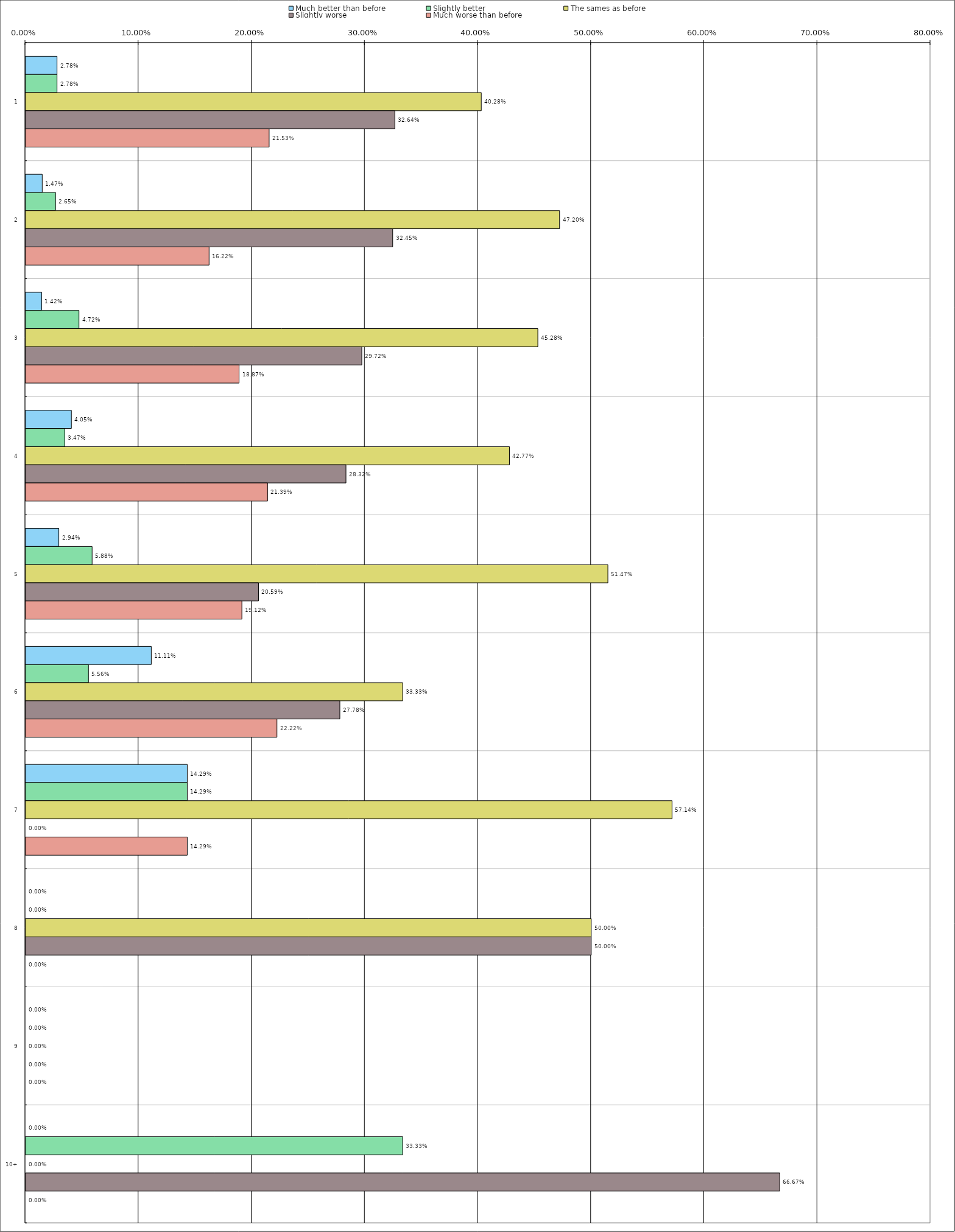
| Category | Much better than before | Slightly better | The sames as before | Slightly worse | Much worse than before |
|---|---|---|---|---|---|
| 0 | 0.028 | 0.028 | 0.403 | 0.326 | 0.215 |
| 1 | 0.015 | 0.026 | 0.472 | 0.324 | 0.162 |
| 2 | 0.014 | 0.047 | 0.453 | 0.297 | 0.189 |
| 3 | 0.04 | 0.035 | 0.428 | 0.283 | 0.214 |
| 4 | 0.029 | 0.059 | 0.515 | 0.206 | 0.191 |
| 5 | 0.111 | 0.056 | 0.333 | 0.278 | 0.222 |
| 6 | 0.143 | 0.143 | 0.571 | 0 | 0.143 |
| 7 | 0 | 0 | 0.5 | 0.5 | 0 |
| 8 | 0 | 0 | 0 | 0 | 0 |
| 9 | 0 | 0.333 | 0 | 0.667 | 0 |